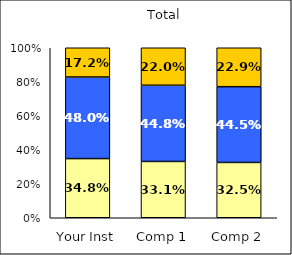
| Category | Low Academic Disengagement | Average Academic Disengagement | High Academic Disengagement |
|---|---|---|---|
| Your Inst | 0.348 | 0.48 | 0.172 |
| Comp 1 | 0.331 | 0.448 | 0.22 |
| Comp 2 | 0.325 | 0.445 | 0.229 |